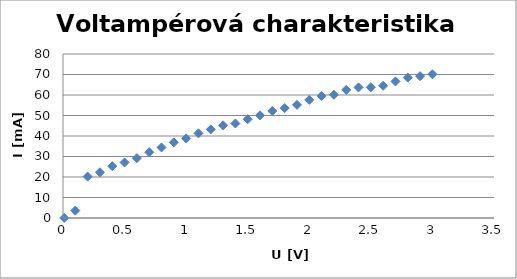
| Category | I |
|---|---|
| 0.01 | 0.03 |
| 0.1 | 3.6 |
| 0.2 | 20.2 |
| 0.3 | 22.3 |
| 0.4 | 25.3 |
| 0.5 | 27.1 |
| 0.6 | 29.2 |
| 0.7 | 32.1 |
| 0.8 | 34.4 |
| 0.9 | 36.9 |
| 1.0 | 38.8 |
| 1.1 | 41.3 |
| 1.2 | 43.2 |
| 1.3 | 45.2 |
| 1.4 | 46.1 |
| 1.5 | 48.2 |
| 1.6 | 50.1 |
| 1.7 | 52.2 |
| 1.8 | 53.6 |
| 1.9 | 55.2 |
| 2.0 | 57.6 |
| 2.1 | 59.5 |
| 2.2 | 60.1 |
| 2.3 | 62.5 |
| 2.4 | 63.7 |
| 2.5 | 63.8 |
| 2.6 | 64.5 |
| 2.7 | 66.6 |
| 2.8 | 68.5 |
| 2.9 | 69.2 |
| 3.0 | 70.1 |